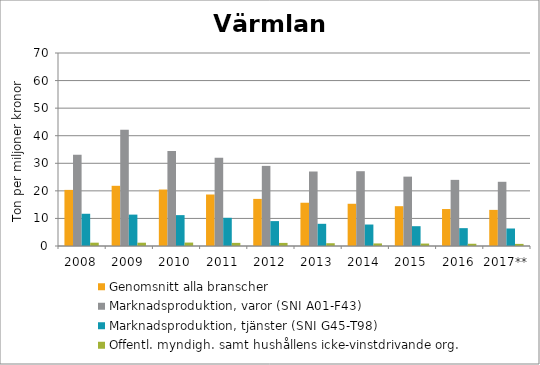
| Category | Genomsnitt alla branscher | Marknadsproduktion, varor (SNI A01-F43) | Marknadsproduktion, tjänster (SNI G45-T98) | Offentl. myndigh. samt hushållens icke-vinstdrivande org. |
|---|---|---|---|---|
| 2008 | 20.35 | 33.136 | 11.691 | 1.204 |
| 2009 | 21.832 | 42.191 | 11.385 | 1.197 |
| 2010 | 20.478 | 34.467 | 11.198 | 1.242 |
| 2011 | 18.678 | 32.052 | 10.226 | 1.134 |
| 2012 | 17.085 | 29.059 | 9.03 | 1.124 |
| 2013 | 15.691 | 27.018 | 8.05 | 1.006 |
| 2014 | 15.315 | 27.124 | 7.788 | 0.932 |
| 2015 | 14.437 | 25.159 | 7.184 | 0.887 |
| 2016 | 13.41 | 23.985 | 6.474 | 0.816 |
| 2017** | 13.096 | 23.287 | 6.349 | 0.766 |